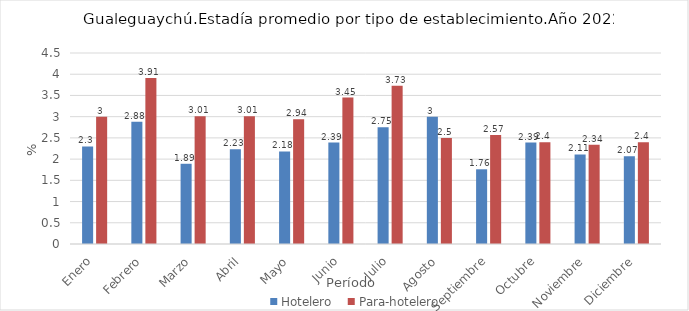
| Category | Hotelero | Para-hotelero |
|---|---|---|
| Enero | 2.3 | 3 |
| Febrero | 2.88 | 3.91 |
| Marzo | 1.89 | 3.01 |
| Abril | 2.23 | 3.01 |
| Mayo | 2.18 | 2.94 |
| Junio | 2.39 | 3.45 |
| Julio | 2.75 | 3.73 |
| Agosto | 3 | 2.5 |
| Septiembre | 1.76 | 2.57 |
| Octubre | 2.39 | 2.4 |
| Noviembre | 2.11 | 2.34 |
| Diciembre | 2.07 | 2.4 |